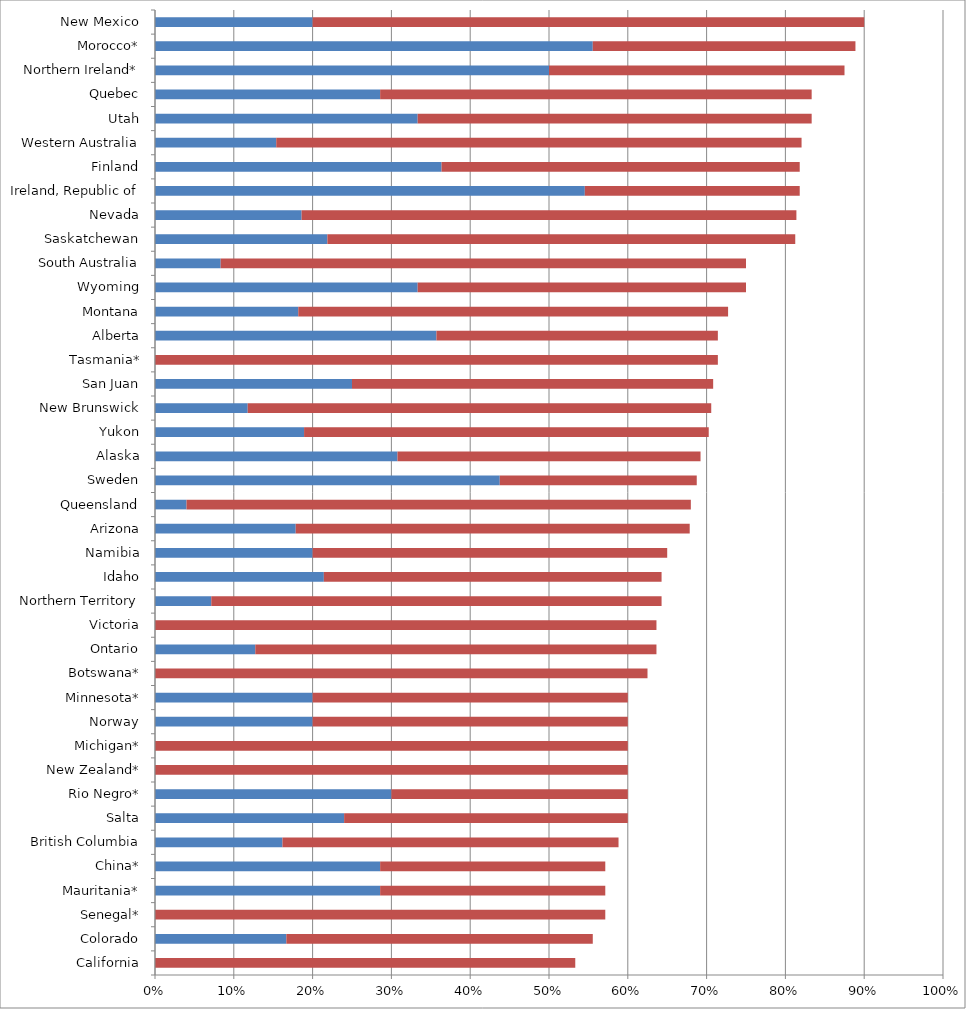
| Category | Series 0 | Series 1 |
|---|---|---|
| California | 0 | 0.533 |
| Colorado | 0.167 | 0.389 |
| Senegal* | 0 | 0.571 |
| Mauritania* | 0.286 | 0.286 |
| China* | 0.286 | 0.286 |
| British Columbia | 0.162 | 0.426 |
| Salta | 0.24 | 0.36 |
| Rio Negro* | 0.3 | 0.3 |
| New Zealand* | 0 | 0.6 |
| Michigan* | 0 | 0.6 |
| Norway | 0.2 | 0.4 |
| Minnesota* | 0.2 | 0.4 |
| Botswana* | 0 | 0.625 |
| Ontario | 0.127 | 0.509 |
| Victoria | 0 | 0.636 |
| Northern Territory | 0.071 | 0.571 |
| Idaho | 0.214 | 0.429 |
| Namibia | 0.2 | 0.45 |
| Arizona | 0.179 | 0.5 |
| Queensland | 0.04 | 0.64 |
| Sweden | 0.438 | 0.25 |
| Alaska | 0.308 | 0.385 |
| Yukon | 0.189 | 0.514 |
| New Brunswick | 0.118 | 0.588 |
| San Juan | 0.25 | 0.458 |
| Tasmania* | 0 | 0.714 |
| Alberta | 0.357 | 0.357 |
| Montana | 0.182 | 0.545 |
| Wyoming | 0.333 | 0.417 |
| South Australia | 0.083 | 0.667 |
| Saskatchewan | 0.219 | 0.594 |
| Nevada | 0.186 | 0.628 |
| Ireland, Republic of | 0.545 | 0.273 |
| Finland | 0.364 | 0.455 |
| Western Australia | 0.154 | 0.667 |
| Utah | 0.333 | 0.5 |
| Quebec | 0.286 | 0.548 |
| Northern Ireland* | 0.5 | 0.375 |
| Morocco* | 0.556 | 0.333 |
| New Mexico | 0.2 | 0.7 |